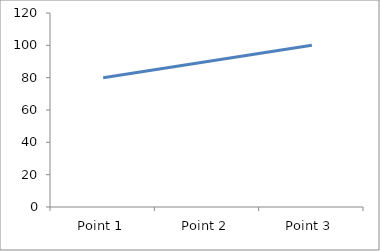
| Category | Series 3 |
|---|---|
| Point 1 | 80 |
| Point 2 | 90 |
| Point 3 | 100 |